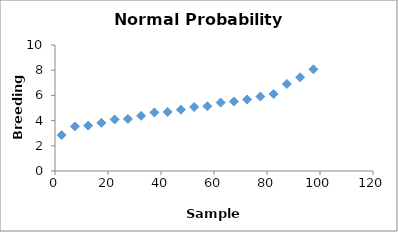
| Category | Series 0 |
|---|---|
| 2.5 | 2.85 |
| 7.5 | 3.54 |
| 12.5 | 3.6 |
| 17.5 | 3.82 |
| 22.5 | 4.09 |
| 27.5 | 4.13 |
| 32.5 | 4.38 |
| 37.5 | 4.65 |
| 42.5 | 4.69 |
| 47.5 | 4.87 |
| 52.5 | 5.08 |
| 57.5 | 5.14 |
| 62.5 | 5.43 |
| 67.5 | 5.52 |
| 72.5 | 5.68 |
| 77.5 | 5.91 |
| 82.5 | 6.11 |
| 87.5 | 6.91 |
| 92.5 | 7.44 |
| 97.5 | 8.07 |